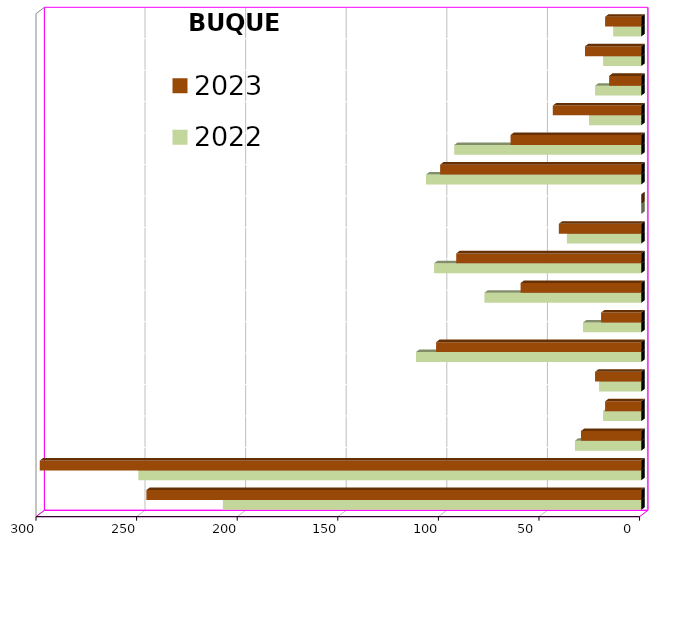
| Category | 2022 | 2023 |
|---|---|---|
| ICAVE | 208 | 246 |
| CICE | 250 | 299 |
| T. C. E. | 33 | 30 |
| CARGILL | 19 | 18 |
| TMV | 21 | 23 |
| SSA | 112 | 102 |
| SEPSA | 29 | 20 |
| VOPAK | 78 | 60 |
| CPV | 103 | 92 |
| EXCELLENCE | 37 | 41 |
| APASCO | 0 | 0 |
| SIPPB | 107 | 100 |
| PEMEX | 93 | 65 |
| PETRA | 26 | 44 |
| OPEVER | 23 | 16 |
| ESJ Renovable III | 19 | 28 |
| Tramitadora del Pac. | 14 | 18 |